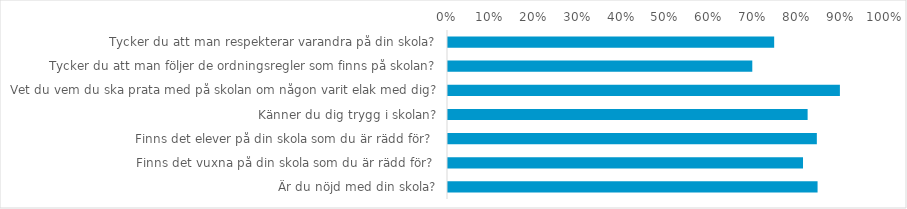
| Category | (Alla) |
|---|---|
| Tycker du att man respekterar varandra på din skola? | 0.745 |
| Tycker du att man följer de ordningsregler som finns på skolan? | 0.695 |
| Vet du vem du ska prata med på skolan om någon varit elak med dig? | 0.895 |
| Känner du dig trygg i skolan? | 0.821 |
| Finns det elever på din skola som du är rädd för?  | 0.842 |
| Finns det vuxna på din skola som du är rädd för?  | 0.811 |
| Är du nöjd med din skola? | 0.844 |